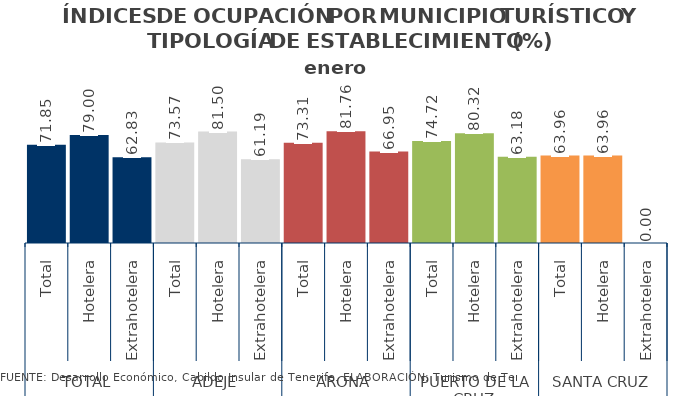
| Category | enero 2014 |
|---|---|
| 0 | 71.85 |
| 1 | 79 |
| 2 | 62.83 |
| 3 | 73.57 |
| 4 | 81.5 |
| 5 | 61.19 |
| 6 | 73.31 |
| 7 | 81.76 |
| 8 | 66.95 |
| 9 | 74.72 |
| 10 | 80.315 |
| 11 | 63.18 |
| 12 | 63.96 |
| 13 | 63.96 |
| 14 | 0 |